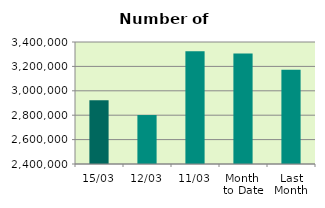
| Category | Series 0 |
|---|---|
| 15/03 | 2923068 |
| 12/03 | 2801348 |
| 11/03 | 3323270 |
| Month 
to Date | 3305576.545 |
| Last
Month | 3172414.4 |